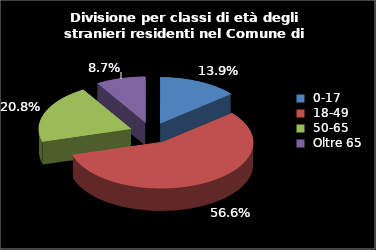
| Category | Series 0 |
|---|---|
| 0-17 | 72 |
| 18-49 | 294 |
| 50-65 | 108 |
| Oltre 65 | 45 |